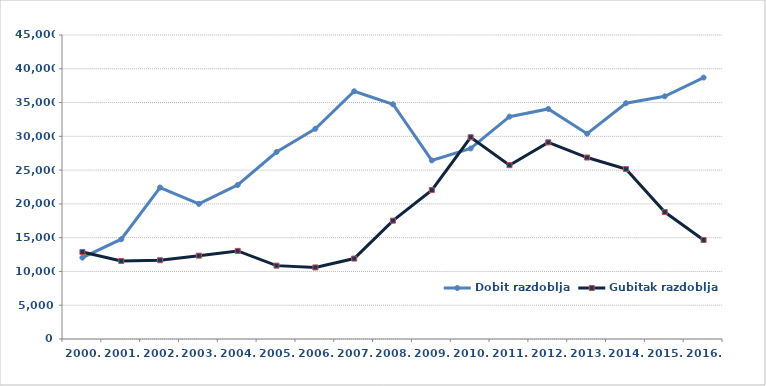
| Category | Dobit razdoblja | Gubitak razdoblja |
|---|---|---|
| 2000. | 12046 | 12884 |
| 2001. | 14771 | 11552 |
| 2002. | 22423 | 11658 |
| 2003. | 19994 | 12336 |
| 2004. | 22801 | 13039 |
| 2005. | 27683 | 10861 |
| 2006. | 31121 | 10595 |
| 2007. | 36668 | 11904 |
| 2008. | 34746 | 17517 |
| 2009. | 26438 | 22041 |
| 2010. | 28203 | 29866 |
| 2011. | 32911 | 25731 |
| 2012. | 34053 | 29112 |
| 2013. | 30392 | 26862 |
| 2014. | 34904 | 25150 |
| 2015. | 35925.884 | 18786.38 |
| 2016. | 38695.898 | 14660.642 |